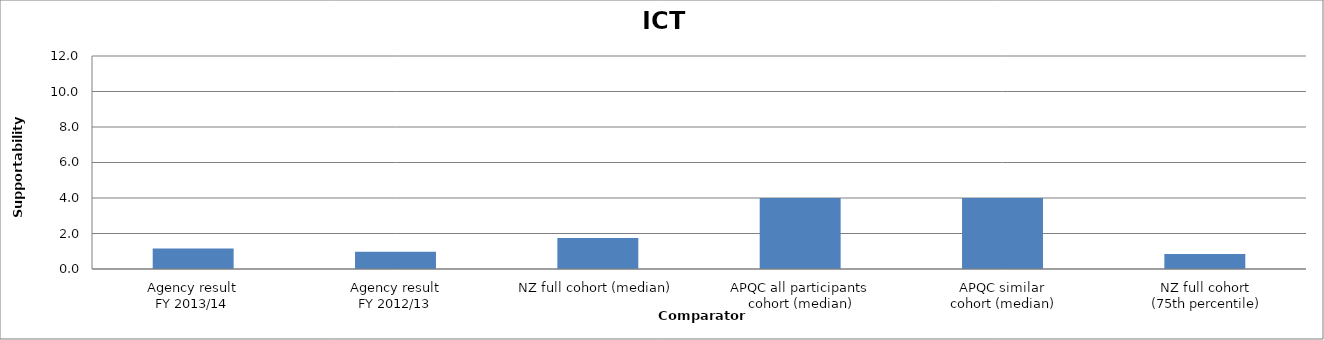
| Category | Result |
|---|---|
| Agency result
FY 2013/14 | 1.15 |
| Agency result
FY 2012/13 | 0.97 |
| NZ full cohort (median) | 1.75 |
| APQC all participants
 cohort (median) | 4 |
| APQC similar
 cohort (median) | 4 |
| NZ full cohort
 (75th percentile) | 0.85 |